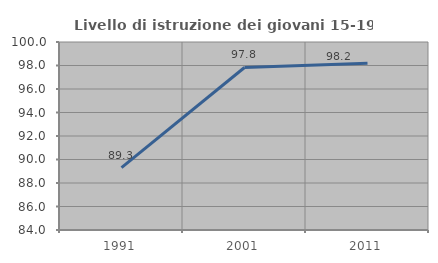
| Category | Livello di istruzione dei giovani 15-19 anni |
|---|---|
| 1991.0 | 89.309 |
| 2001.0 | 97.831 |
| 2011.0 | 98.198 |